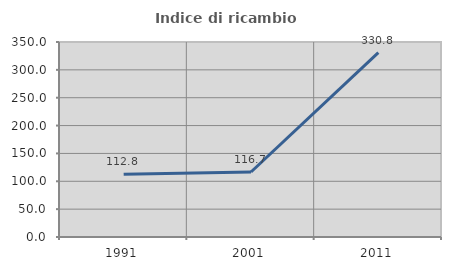
| Category | Indice di ricambio occupazionale  |
|---|---|
| 1991.0 | 112.821 |
| 2001.0 | 116.667 |
| 2011.0 | 330.769 |